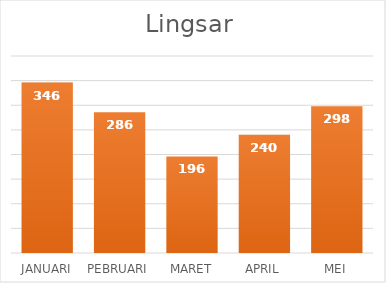
| Category |  346  |
|---|---|
| JANUARI | 346 |
| PEBRUARI | 286 |
| MARET | 196 |
| APRIL | 240 |
| MEI | 298 |